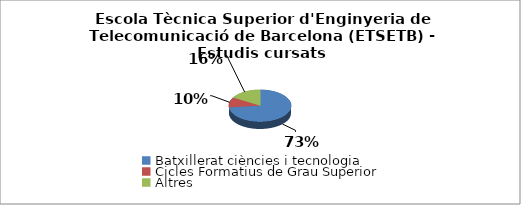
| Category | Escola Tècnica Superior d'Enginyeria de Telecomunicació de Barcelona (ETSETB) - Estudis cursats |
|---|---|
| Batxillerat ciències i tecnologia | 0.732 |
| Cicles Formatius de Grau Superior | 0.103 |
| Altres | 0.165 |